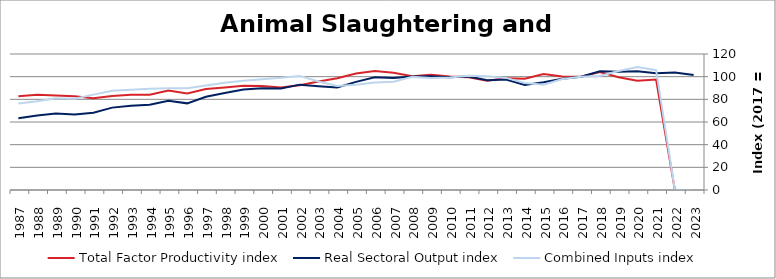
| Category | Total Factor Productivity index | Real Sectoral Output index | Combined Inputs index |
|---|---|---|---|
| 2023.0 | 0 | 101.384 | 0 |
| 2022.0 | 0 | 103.776 | 0 |
| 2021.0 | 97.479 | 103.076 | 105.742 |
| 2020.0 | 96.377 | 104.67 | 108.605 |
| 2019.0 | 99.505 | 104.431 | 104.951 |
| 2018.0 | 104.167 | 104.805 | 100.612 |
| 2017.0 | 100 | 100 | 100 |
| 2016.0 | 100.171 | 98.142 | 97.975 |
| 2015.0 | 102.354 | 95.087 | 92.9 |
| 2014.0 | 98.248 | 92.757 | 94.412 |
| 2013.0 | 98.603 | 97.545 | 98.927 |
| 2012.0 | 96.47 | 96.872 | 100.417 |
| 2011.0 | 99.471 | 100.207 | 100.739 |
| 2010.0 | 100.229 | 99.418 | 99.191 |
| 2009.0 | 101.593 | 100.313 | 98.74 |
| 2008.0 | 100.329 | 100.138 | 99.81 |
| 2007.0 | 103.516 | 98.914 | 95.554 |
| 2006.0 | 104.929 | 99.527 | 94.851 |
| 2005.0 | 102.815 | 95.412 | 92.8 |
| 2004.0 | 98.554 | 90.541 | 91.87 |
| 2003.0 | 95.761 | 91.648 | 95.705 |
| 2002.0 | 92.348 | 92.966 | 100.669 |
| 2001.0 | 90.346 | 89.471 | 99.031 |
| 2000.0 | 91.844 | 89.823 | 97.8 |
| 1999.0 | 92.036 | 88.724 | 96.402 |
| 1998.0 | 90.483 | 85.634 | 94.642 |
| 1997.0 | 89.182 | 82.256 | 92.234 |
| 1996.0 | 85.083 | 76.454 | 89.858 |
| 1995.0 | 87.823 | 78.767 | 89.688 |
| 1994.0 | 84.012 | 75.133 | 89.431 |
| 1993.0 | 84.058 | 74.369 | 88.474 |
| 1992.0 | 82.963 | 72.688 | 87.614 |
| 1991.0 | 81.043 | 68.2 | 84.153 |
| 1990.0 | 82.74 | 66.554 | 80.438 |
| 1989.0 | 83.378 | 67.453 | 80.9 |
| 1988.0 | 83.962 | 65.827 | 78.401 |
| 1987.0 | 82.734 | 63.223 | 76.418 |